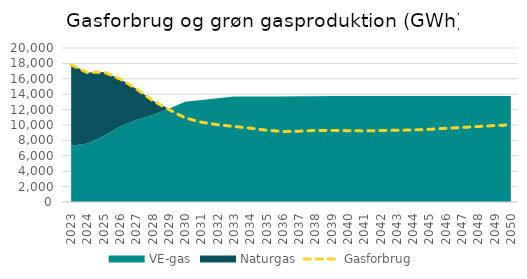
| Category | Gasforbrug |
|---|---|
| 0 | 17813.43 |
| 1 | 16807.03 |
| 2 | 16882.75 |
| 3 | 15982.23 |
| 4 | 14711.09 |
| 5 | 13180.5 |
| 6 | 12007.89 |
| 7 | 10930.52 |
| 8 | 10358.46 |
| 9 | 10037.55 |
| 10 | 9808.73 |
| 11 | 9592.49 |
| 12 | 9317.05 |
| 13 | 9163.35 |
| 14 | 9199.28 |
| 15 | 9296.79 |
| 16 | 9299.89 |
| 17 | 9262.7 |
| 18 | 9229.56 |
| 19 | 9288.58 |
| 20 | 9307.14 |
| 21 | 9355.81 |
| 22 | 9433.4 |
| 23 | 9577.1 |
| 24 | 9676.65 |
| 25 | 9805.01 |
| 26 | 9928.93 |
| 27 | 10021.87 |